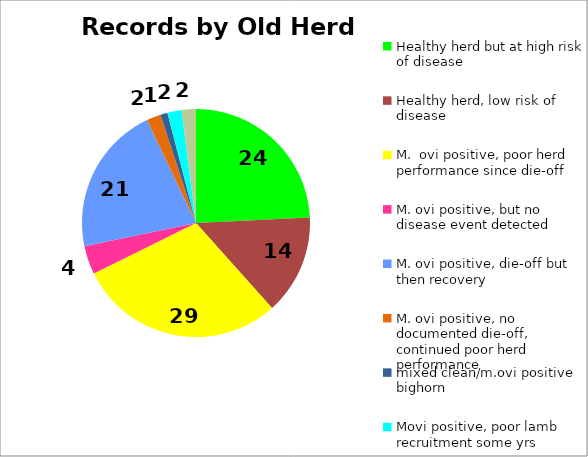
| Category | Series 0 |
|---|---|
| Healthy herd but at high risk of disease | 24 |
| Healthy herd, low risk of disease | 14 |
| M.  ovi positive, poor herd performance since die-off | 29 |
| M. ovi positive, but no disease event detected | 4 |
| M. ovi positive, die-off but then recovery | 21 |
| M. ovi positive, no documented die-off, continued poor herd performance | 2 |
| mixed clean/m.ovi positive bighorn | 1 |
| Movi positive, poor lamb recruitment some yrs | 2 |
| Unknown M. ovi. exposure, experienced die-off, continued poor herd performance | 2 |